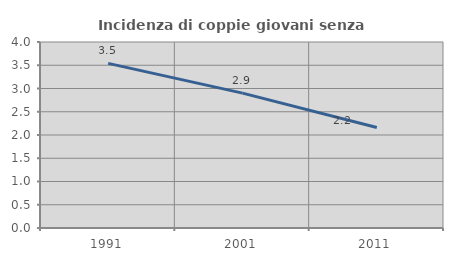
| Category | Incidenza di coppie giovani senza figli |
|---|---|
| 1991.0 | 3.54 |
| 2001.0 | 2.901 |
| 2011.0 | 2.162 |